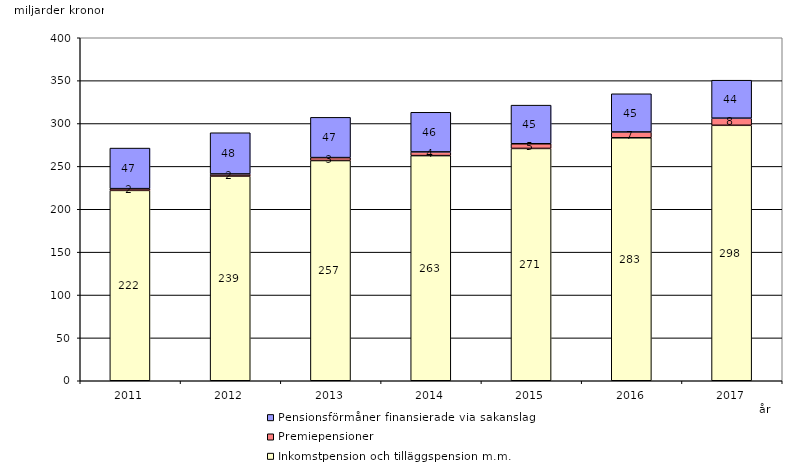
| Category | Inkomstpension och tilläggspension m.m. | Premiepensioner | Pensionsförmåner finansierade via sakanslag |
|---|---|---|---|
| 2011.0 | 222.004 | 2.022 | 47.319 |
| 2012.0 | 238.73 | 2.466 | 48.027 |
| 2013.0 | 256.828 | 3.395 | 46.963 |
| 2014.0 | 262.56 | 4.331 | 46.192 |
| 2015.0 | 270.931 | 5.448 | 45.049 |
| 2016.0 | 283.351 | 6.784 | 44.538 |
| 2017.0 | 297.907 | 8.323 | 44.264 |